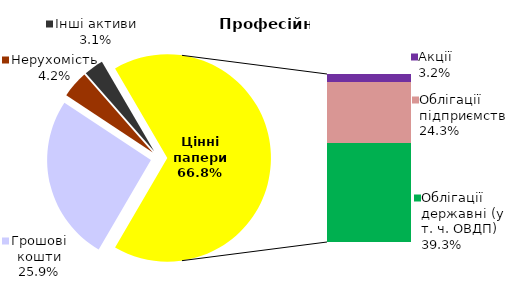
| Category | Професійні |
|---|---|
| Грошові кошти | 30872707.54 |
| Банківські метали | 0 |
| Нерухомість | 5050938.84 |
| Інші активи | 3644434.27 |
| Акції | 3799458.108 |
| Облігації підприємств | 28927238.951 |
| Муніципальні облігації | 0 |
| Облігації державні (у т. ч. ОВДП) | 46897102.628 |